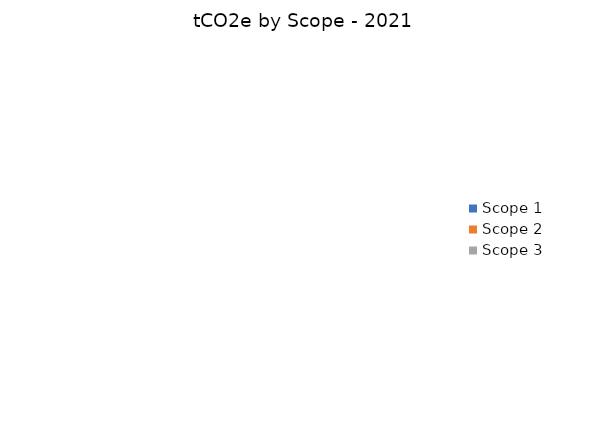
| Category |  tCO2e by Scope - 2021 |
|---|---|
| Scope 1 | 0 |
| Scope 2 | 0 |
| Scope 3 | 0 |